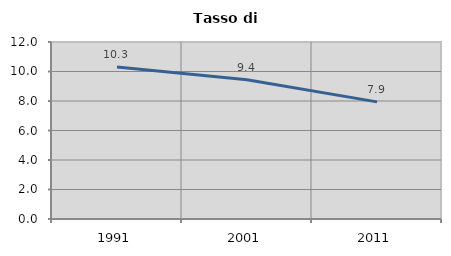
| Category | Tasso di disoccupazione   |
|---|---|
| 1991.0 | 10.309 |
| 2001.0 | 9.44 |
| 2011.0 | 7.941 |